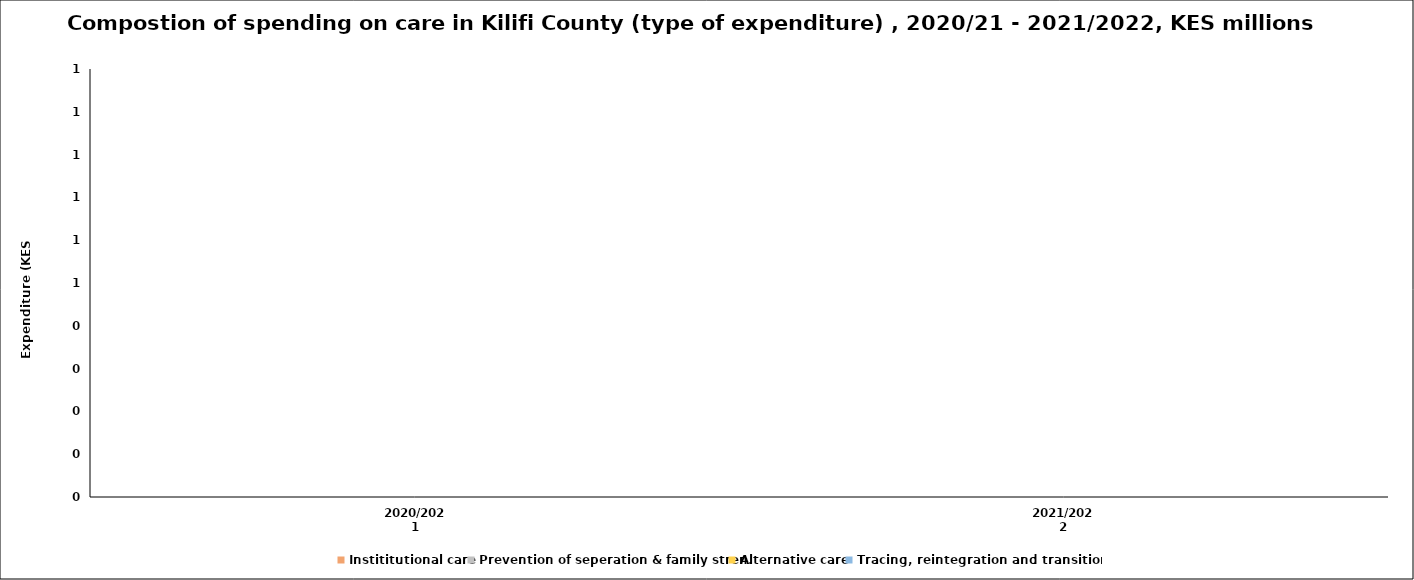
| Category | Instititutional care | Prevention of seperation & family stren. | Alternative care | Tracing, reintegration and transitioning |
|---|---|---|---|---|
| 2020/2021 | 0 | 0 | 0 | 0 |
| 2021/2022 | 0 | 0 | 0 | 0 |